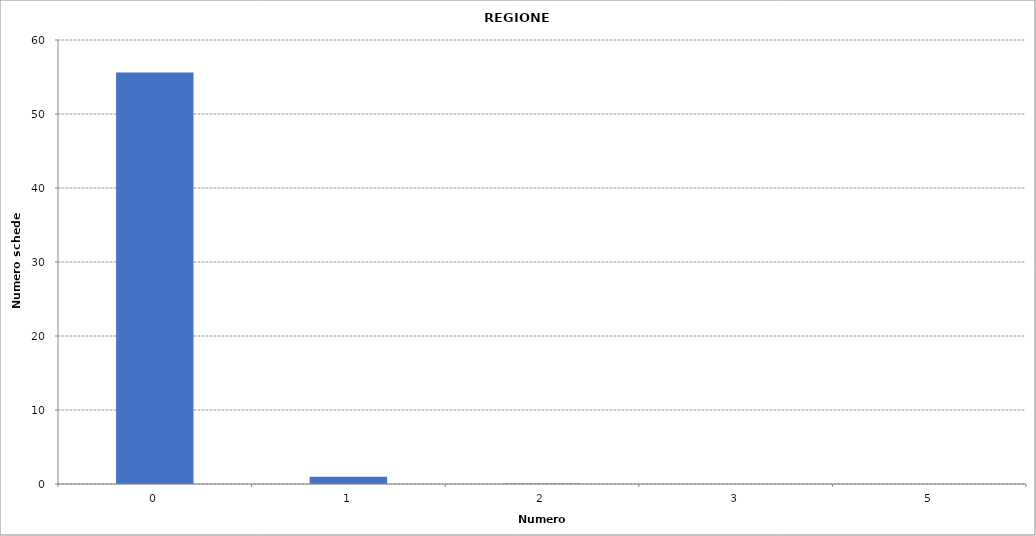
| Category | Series 0 |
|---|---|
| 0.0 | 55607 |
| 1.0 | 982 |
| 2.0 | 51 |
| 3.0 | 8 |
| 5.0 | 2 |